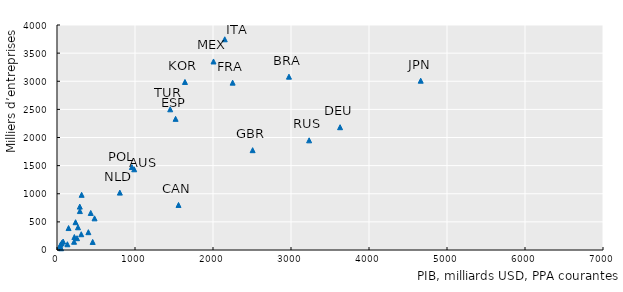
| Category | Series 0 |
|---|---|
| 989.7850685000001 | 1435.026 |
| 402.0603922 | 316.834 |
| 481.5300358 | 562.513 |
| #N/A | 310.727 |
| 2973.8561489 | 3081.617 |
| 1558.0189672000001 | 800.79 |
| 457.4633965 | 143.08 |
| 315.8862559 | 980.962 |
| 3629.0209746 | 2182.838 |
| 256.4963376 | 209.828 |
| 1520.5450537000002 | 2331.544 |
| 35.8090677 | 62.275 |
| 222.7342424 | 230.555 |
| 2251.6408369 | 2975.032 |
| 2508.1351007 | 1774.536 |
| 293.3538026 | 691.746 |
| #N/A | 144.863 |
| 237.8016983 | 493.957 |
| 218.8772453 | 146.562 |
| 269.0430728 | 404.047 |
| 2150.8234751 | 3746.143 |
| 4662.9246534 | 3009.905 |
| 1640.3768231 | 2987.288 |
| 78.41161460000001 | 150.841 |
| 52.1237596 | 30.678 |
| 45.4033233 | 96.046 |
| 2006.4339356 | 3351.56 |
| 805.848343 | 1020.084 |
| 310.7403038 | 280.805 |
| 133.3786 | 101.988 |
| 960.2356302999999 | 1474.942 |
| 292.0715834 | 771.598 |
| #N/A | 432.746 |
| 3232.1983344 | 1949.704 |
| 148.40379620000002 | 390.227 |
| 59.939606399999995 | 125.664 |
| 432.66446840000003 | 658.527 |
| 1451.5179516 | 2501.176 |